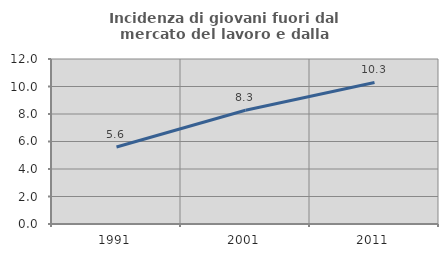
| Category | Incidenza di giovani fuori dal mercato del lavoro e dalla formazione  |
|---|---|
| 1991.0 | 5.6 |
| 2001.0 | 8.271 |
| 2011.0 | 10.294 |